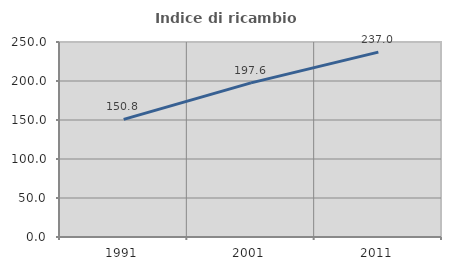
| Category | Indice di ricambio occupazionale  |
|---|---|
| 1991.0 | 150.763 |
| 2001.0 | 197.581 |
| 2011.0 | 236.992 |